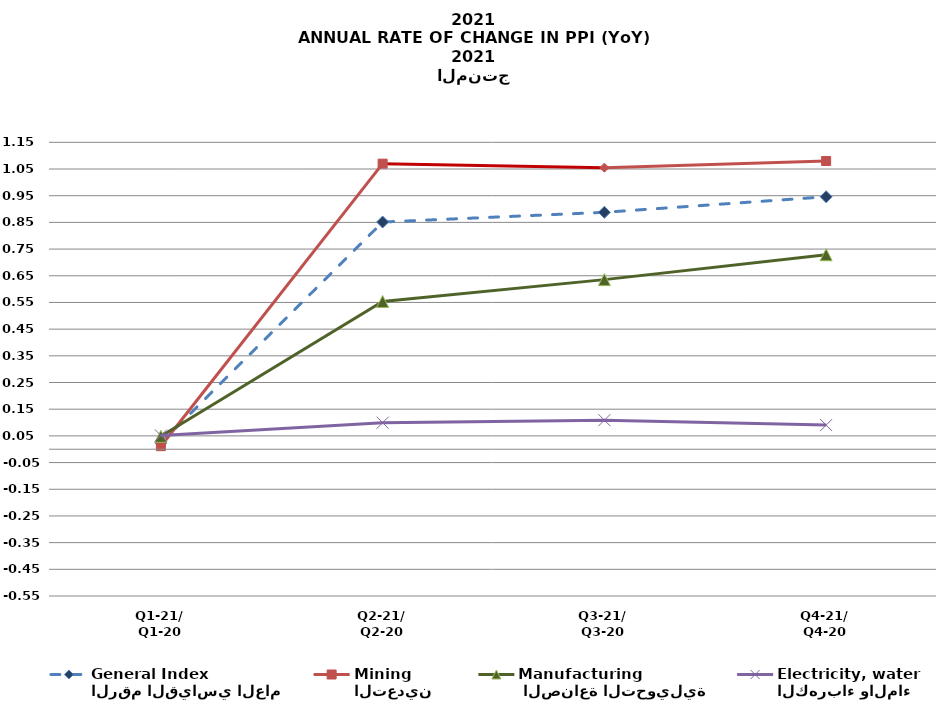
| Category | الرقم القياسي العام 
General Index | التعدين
Mining |  الصناعة التحويلية
Manufacturing | الكهرباء والماء 
Electricity, water
 |
|---|---|---|---|---|
| Q1-21/
Q1-20 | 2.372 | 1.135 | 4.851 | 5.138 |
| Q2-21/
Q2-20 | 85.134 | 107.011 | 55.38 | 9.943 |
| Q3-21/
Q3-20 | 88.781 | 105.509 | 63.554 | 10.887 |
| Q4-21/
Q4-20 | 94.604 | 108.011 | 72.876 | 9.05 |